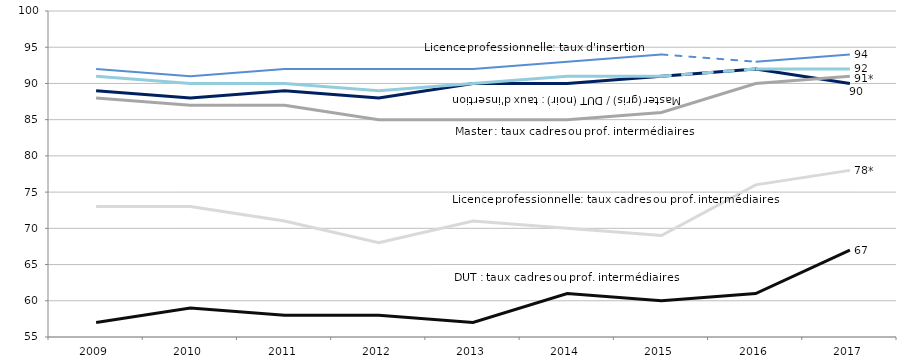
| Category | DUT   | Licence professionnelle | Master |
|---|---|---|---|
| 2009.0 | 57 | 73 | 88 |
| 2010.0 | 59 | 73 | 87 |
| 2011.0 | 58 | 71 | 87 |
| 2012.0 | 58 | 68 | 85 |
| 2013.0 | 57 | 71 | 85 |
| 2014.0 | 61 | 70 | 85 |
| 2015.0 | 60 | 69 | 86 |
| 2016.0 | 61 | 76 | 90 |
| 2017.0 | 67 | 78 | 91 |